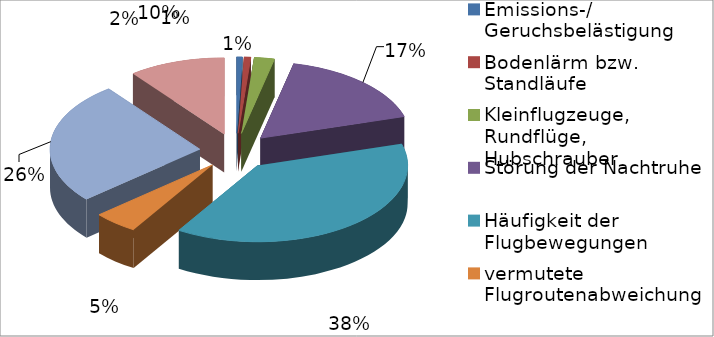
| Category | Series 0 |
|---|---|
| Emissions-/ Geruchsbelästigung | 31 |
| Bodenlärm bzw. Standläufe | 36 |
| Kleinflugzeuge, Rundflüge, Hubschrauber | 108 |
| Störung der Nachtruhe | 833 |
| Häufigkeit der Flugbewegungen | 1895 |
| vermutete Flugroutenabweichung | 239 |
| zu tief, bzw. zu laut empfundene Flugzeuge | 1281 |
| Sonstige (inkl. Bahnsperr.) | 514 |